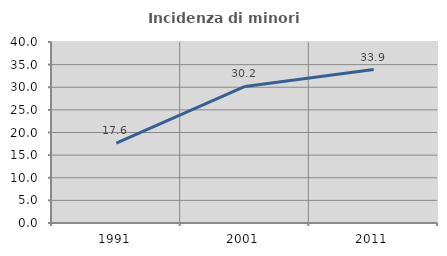
| Category | Incidenza di minori stranieri |
|---|---|
| 1991.0 | 17.647 |
| 2001.0 | 30.168 |
| 2011.0 | 33.898 |